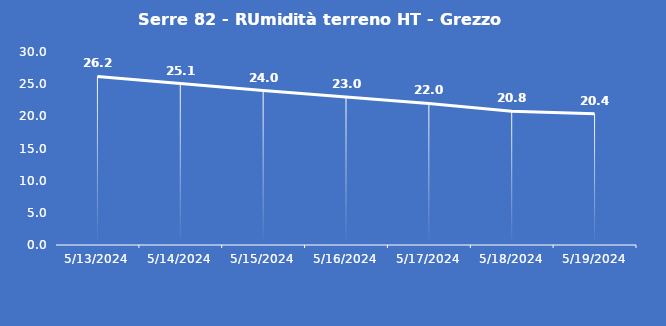
| Category | Serre 82 - RUmidità terreno HT - Grezzo (%VWC) |
|---|---|
| 5/13/24 | 26.2 |
| 5/14/24 | 25.1 |
| 5/15/24 | 24 |
| 5/16/24 | 23 |
| 5/17/24 | 22 |
| 5/18/24 | 20.8 |
| 5/19/24 | 20.4 |